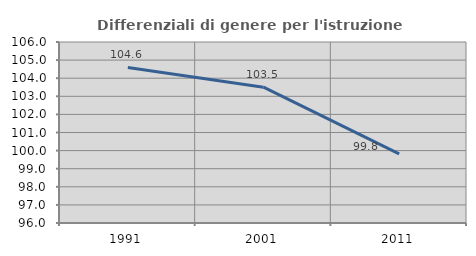
| Category | Differenziali di genere per l'istruzione superiore |
|---|---|
| 1991.0 | 104.593 |
| 2001.0 | 103.502 |
| 2011.0 | 99.814 |